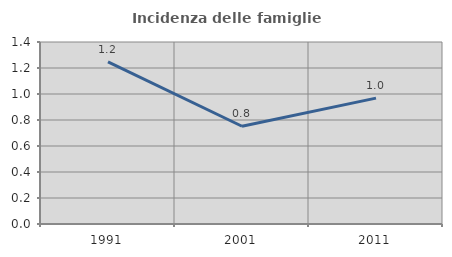
| Category | Incidenza delle famiglie numerose |
|---|---|
| 1991.0 | 1.247 |
| 2001.0 | 0.752 |
| 2011.0 | 0.968 |